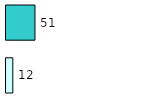
| Category | Series 0 | Series 1 |
|---|---|---|
| 0 | 12 | 51 |